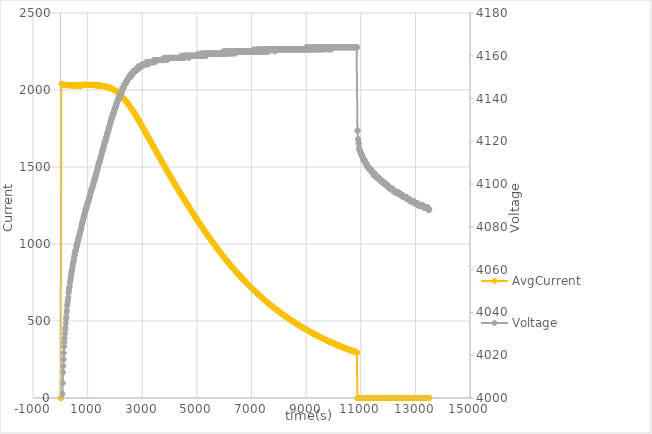
| Category | AvgCurrent |
|---|---|
| 10.006 | 0 |
| 20.006 | 0 |
| 30.019 | 0 |
| 40.023 | 2040 |
| 50.027 | 2039 |
| 60.031 | 2038 |
| 70.038 | 2037 |
| 80.047 | 2036 |
| 90.062 | 2036 |
| 100.077 | 2036 |
| 110.084 | 2035 |
| 120.089 | 2035 |
| 130.104 | 2035 |
| 140.104 | 2034 |
| 150.116 | 2034 |
| 160.123 | 2034 |
| 170.134 | 2033 |
| 180.145 | 2033 |
| 190.158 | 2033 |
| 200.158 | 2032 |
| 210.168 | 2033 |
| 220.179 | 2032 |
| 230.188 | 2032 |
| 240.195 | 2032 |
| 250.199 | 2032 |
| 260.206 | 2032 |
| 270.21 | 2031 |
| 280.215 | 2031 |
| 290.226 | 2031 |
| 300.24 | 2032 |
| 310.255 | 2031 |
| 320.259 | 2031 |
| 330.265 | 2031 |
| 340.281 | 2031 |
| 350.292 | 2031 |
| 360.301 | 2031 |
| 370.305 | 2031 |
| 380.309 | 2031 |
| 390.318 | 2031 |
| 400.33 | 2031 |
| 410.338 | 2031 |
| 420.349 | 2031 |
| 430.361 | 2031 |
| 440.387 | 2030 |
| 450.39 | 2030 |
| 460.401 | 2030 |
| 470.414 | 2030 |
| 480.427 | 2030 |
| 490.437 | 2030 |
| 500.45 | 2030 |
| 510.456 | 2030 |
| 520.49 | 2030 |
| 530.471 | 2030 |
| 540.505 | 2030 |
| 550.492 | 2030 |
| 560.556 | 2029 |
| 570.515 | 2029 |
| 580.604 | 2029 |
| 590.523 | 2030 |
| 600.673 | 2029 |
| 610.548 | 2029 |
| 620.68 | 2029 |
| 630.57 | 2029 |
| 640.741 | 2029 |
| 650.585 | 2029 |
| 660.775 | 2029 |
| 670.61 | 2029 |
| 680.835 | 2029 |
| 690.627 | 2029 |
| 700.866 | 2029 |
| 710.634 | 2029 |
| 720.899 | 2028 |
| 730.649 | 2029 |
| 740.929 | 2028 |
| 750.658 | 2028 |
| 760.978 | 2029 |
| 770.673 | 2028 |
| 781.023 | 2034 |
| 790.688 | 2034 |
| 801.056 | 2033 |
| 810.709 | 2034 |
| 821.145 | 2034 |
| 830.724 | 2033 |
| 841.147 | 2034 |
| 850.737 | 2033 |
| 861.178 | 2033 |
| 870.761 | 2033 |
| 881.212 | 2033 |
| 890.78 | 2033 |
| 901.255 | 2033 |
| 910.786 | 2033 |
| 921.317 | 2034 |
| 930.812 | 2034 |
| 941.32 | 2034 |
| 950.824 | 2034 |
| 961.398 | 2034 |
| 970.837 | 2034 |
| 981.415 | 2034 |
| 990.851 | 2034 |
| 1001.477 | 2033 |
| 1010.867 | 2034 |
| 1021.524 | 2033 |
| 1030.868 | 2033 |
| 1041.568 | 2033 |
| 1050.876 | 2033 |
| 1061.632 | 2033 |
| 1070.887 | 2033 |
| 1081.696 | 2033 |
| 1090.909 | 2033 |
| 1101.711 | 2032 |
| 1110.912 | 2033 |
| 1121.74 | 2033 |
| 1130.926 | 2033 |
| 1141.804 | 2033 |
| 1150.934 | 2032 |
| 1161.825 | 2032 |
| 1170.955 | 2032 |
| 1181.866 | 2032 |
| 1190.976 | 2032 |
| 1201.913 | 2032 |
| 1210.984 | 2032 |
| 1221.945 | 2032 |
| 1230.992 | 2032 |
| 1242.056 | 2032 |
| 1251.014 | 2031 |
| 1262.009 | 2031 |
| 1271.017 | 2031 |
| 1282.084 | 2031 |
| 1291.038 | 2031 |
| 1302.119 | 2031 |
| 1311.042 | 2031 |
| 1322.163 | 2031 |
| 1331.056 | 2031 |
| 1342.209 | 2030 |
| 1351.071 | 2030 |
| 1362.228 | 2030 |
| 1371.088 | 2029 |
| 1382.29 | 2030 |
| 1391.101 | 2030 |
| 1402.351 | 2030 |
| 1411.124 | 2030 |
| 1422.369 | 2030 |
| 1431.141 | 2030 |
| 1442.428 | 2029 |
| 1451.151 | 2028 |
| 1462.461 | 2028 |
| 1471.165 | 2028 |
| 1482.506 | 2027 |
| 1491.186 | 2027 |
| 1502.539 | 2027 |
| 1511.197 | 2027 |
| 1522.603 | 2026 |
| 1531.207 | 2026 |
| 1542.601 | 2026 |
| 1551.22 | 2026 |
| 1561.225 | 2026 |
| 1571.225 | 2025 |
| 1581.237 | 2024 |
| 1591.245 | 2024 |
| 1601.25 | 2024 |
| 1611.252 | 2024 |
| 1621.256 | 2023 |
| 1631.266 | 2023 |
| 1641.281 | 2023 |
| 1651.291 | 2022 |
| 1661.303 | 2022 |
| 1671.312 | 2022 |
| 1681.311 | 2021 |
| 1691.312 | 2020 |
| 1701.314 | 2020 |
| 1711.322 | 2020 |
| 1721.338 | 2019 |
| 1731.342 | 2018 |
| 1741.344 | 2018 |
| 1751.357 | 2017 |
| 1761.362 | 2017 |
| 1771.373 | 2016 |
| 1781.38 | 2016 |
| 1791.393 | 2015 |
| 1801.407 | 2014 |
| 1811.407 | 2014 |
| 1821.419 | 2013 |
| 1831.432 | 2012 |
| 1841.437 | 2012 |
| 1851.439 | 2011 |
| 1861.451 | 2010 |
| 1871.459 | 2010 |
| 1881.472 | 2008 |
| 1891.475 | 2008 |
| 1901.531 | 2007 |
| 1911.543 | 2006 |
| 1921.551 | 2005 |
| 1931.566 | 2004 |
| 1941.573 | 2003 |
| 1951.585 | 2002 |
| 1961.589 | 2001 |
| 1971.593 | 2000 |
| 1981.601 | 1999 |
| 1991.607 | 1997 |
| 2001.616 | 1996 |
| 2011.629 | 1996 |
| 2021.635 | 1994 |
| 2031.639 | 1993 |
| 2041.652 | 1992 |
| 2051.652 | 1991 |
| 2061.664 | 1989 |
| 2071.679 | 1988 |
| 2081.692 | 1986 |
| 2091.697 | 1985 |
| 2101.709 | 1984 |
| 2111.712 | 1983 |
| 2121.721 | 1981 |
| 2131.732 | 1979 |
| 2141.737 | 1978 |
| 2151.758 | 1976 |
| 2161.744 | 1975 |
| 2171.819 | 1961 |
| 2181.768 | 1969 |
| 2191.897 | 1968 |
| 2201.794 | 1960 |
| 2211.883 | 1961 |
| 2221.807 | 1960 |
| 2231.897 | 1959 |
| 2241.833 | 1957 |
| 2251.93 | 1956 |
| 2261.849 | 1954 |
| 2271.961 | 1954 |
| 2281.866 | 1952 |
| 2292.022 | 1950 |
| 2301.869 | 1948 |
| 2312.023 | 1947 |
| 2321.88 | 1946 |
| 2332.084 | 1943 |
| 2341.891 | 1941 |
| 2352.102 | 1939 |
| 2361.907 | 1937 |
| 2372.147 | 1935 |
| 2381.927 | 1932 |
| 2392.193 | 1931 |
| 2401.95 | 1928 |
| 2412.227 | 1926 |
| 2421.971 | 1924 |
| 2432.227 | 1922 |
| 2441.987 | 1919 |
| 2452.273 | 1917 |
| 2462.007 | 1915 |
| 2472.322 | 1912 |
| 2482.018 | 1910 |
| 2492.336 | 1907 |
| 2502.04 | 1905 |
| 2512.367 | 1902 |
| 2522.066 | 1900 |
| 2532.385 | 1898 |
| 2542.091 | 1895 |
| 2552.491 | 1892 |
| 2562.109 | 1890 |
| 2572.523 | 1887 |
| 2582.118 | 1884 |
| 2592.555 | 1882 |
| 2602.131 | 1880 |
| 2612.556 | 1877 |
| 2622.143 | 1874 |
| 2632.618 | 1872 |
| 2642.167 | 1869 |
| 2652.664 | 1866 |
| 2662.178 | 1863 |
| 2672.695 | 1861 |
| 2682.181 | 1858 |
| 2692.759 | 1855 |
| 2702.197 | 1853 |
| 2712.773 | 1849 |
| 2722.218 | 1847 |
| 2732.805 | 1844 |
| 2742.235 | 1841 |
| 2752.834 | 1837 |
| 2762.242 | 1836 |
| 2772.848 | 1832 |
| 2782.257 | 1830 |
| 2792.884 | 1826 |
| 2802.266 | 1823 |
| 2812.91 | 1820 |
| 2822.294 | 1818 |
| 2832.955 | 1814 |
| 2842.317 | 1812 |
| 2853.019 | 1808 |
| 2862.326 | 1806 |
| 2873.065 | 1803 |
| 2882.336 | 1799 |
| 2893.08 | 1797 |
| 2902.354 | 1793 |
| 2913.142 | 1791 |
| 2922.365 | 1788 |
| 2933.176 | 1784 |
| 2942.38 | 1782 |
| 2953.218 | 1776 |
| 2962.399 | 1774 |
| 2973.266 | 1770 |
| 2982.418 | 1768 |
| 2993.264 | 1765 |
| 3002.427 | 1761 |
| 3013.328 | 1758 |
| 3022.438 | 1755 |
| 3033.357 | 1752 |
| 3042.445 | 1749 |
| 3053.386 | 1746 |
| 3062.457 | 1743 |
| 3073.419 | 1740 |
| 3082.465 | 1737 |
| 3093.529 | 1734 |
| 3102.487 | 1731 |
| 3113.512 | 1727 |
| 3122.499 | 1725 |
| 3133.512 | 1721 |
| 3142.502 | 1719 |
| 3153.59 | 1714 |
| 3162.512 | 1712 |
| 3173.589 | 1708 |
| 3182.539 | 1705 |
| 3193.619 | 1702 |
| 3202.546 | 1699 |
| 3213.664 | 1695 |
| 3222.57 | 1693 |
| 3233.708 | 1689 |
| 3242.587 | 1687 |
| 3253.755 | 1683 |
| 3262.615 | 1680 |
| 3273.787 | 1676 |
| 3282.636 | 1674 |
| 3293.801 | 1670 |
| 3302.648 | 1667 |
| 3313.88 | 1664 |
| 3322.664 | 1660 |
| 3333.927 | 1657 |
| 3342.68 | 1654 |
| 3353.893 | 1651 |
| 3362.689 | 1648 |
| 3373.957 | 1644 |
| 3382.701 | 1641 |
| 3394.003 | 1638 |
| 3402.725 | 1635 |
| 3413.955 | 1631 |
| 3422.736 | 1629 |
| 3434.017 | 1625 |
| 3442.759 | 1623 |
| 3454.111 | 1619 |
| 3462.775 | 1616 |
| 3474.094 | 1613 |
| 3482.784 | 1610 |
| 3494.126 | 1606 |
| 3502.789 | 1603 |
| 3514.219 | 1599 |
| 3522.818 | 1597 |
| 3534.202 | 1593 |
| 3542.825 | 1590 |
| 3554.246 | 1587 |
| 3562.84 | 1583 |
| 3572.843 | 1581 |
| 3582.846 | 1578 |
| 3592.866 | 1575 |
| 3602.873 | 1572 |
| 3612.884 | 1568 |
| 3622.892 | 1566 |
| 3632.904 | 1562 |
| 3642.911 | 1559 |
| 3652.913 | 1556 |
| 3662.923 | 1553 |
| 3672.924 | 1550 |
| 3682.93 | 1546 |
| 3692.945 | 1543 |
| 3702.946 | 1540 |
| 3712.956 | 1537 |
| 3722.956 | 1534 |
| 3732.966 | 1530 |
| 3742.981 | 1527 |
| 3752.996 | 1524 |
| 3763.006 | 1521 |
| 3773.009 | 1518 |
| 3783.02 | 1515 |
| 3793.03 | 1512 |
| 3803.043 | 1509 |
| 3813.05 | 1506 |
| 3823.05 | 1503 |
| 3833.054 | 1499 |
| 3843.056 | 1496 |
| 3853.071 | 1493 |
| 3863.08 | 1490 |
| 3873.083 | 1487 |
| 3883.098 | 1484 |
| 3893.113 | 1481 |
| 3903.118 | 1477 |
| 3913.118 | 1474 |
| 3923.118 | 1471 |
| 3933.128 | 1468 |
| 3943.13 | 1465 |
| 3953.142 | 1462 |
| 3963.146 | 1459 |
| 3973.16 | 1457 |
| 3983.169 | 1453 |
| 3993.174 | 1450 |
| 4003.18 | 1447 |
| 4013.192 | 1444 |
| 4023.204 | 1441 |
| 4033.208 | 1437 |
| 4043.214 | 1435 |
| 4053.219 | 1432 |
| 4063.22 | 1429 |
| 4073.226 | 1425 |
| 4083.24 | 1422 |
| 4093.242 | 1419 |
| 4103.247 | 1417 |
| 4113.249 | 1413 |
| 4123.254 | 1410 |
| 4133.266 | 1407 |
| 4143.278 | 1404 |
| 4153.279 | 1402 |
| 4163.326 | 1398 |
| 4173.294 | 1395 |
| 4183.341 | 1393 |
| 4193.311 | 1389 |
| 4203.371 | 1386 |
| 4213.34 | 1384 |
| 4223.415 | 1380 |
| 4233.362 | 1377 |
| 4243.45 | 1374 |
| 4253.383 | 1371 |
| 4263.498 | 1368 |
| 4273.39 | 1365 |
| 4283.54 | 1363 |
| 4293.411 | 1360 |
| 4303.543 | 1357 |
| 4313.423 | 1354 |
| 4323.572 | 1351 |
| 4333.446 | 1348 |
| 4343.588 | 1345 |
| 4353.453 | 1341 |
| 4363.631 | 1339 |
| 4373.472 | 1336 |
| 4383.647 | 1333 |
| 4393.494 | 1330 |
| 4403.715 | 1327 |
| 4413.509 | 1325 |
| 4423.724 | 1321 |
| 4433.524 | 1318 |
| 4443.757 | 1315 |
| 4453.549 | 1313 |
| 4463.804 | 1310 |
| 4473.573 | 1307 |
| 4483.831 | 1304 |
| 4493.589 | 1301 |
| 4503.883 | 1298 |
| 4513.611 | 1295 |
| 4523.91 | 1293 |
| 4533.621 | 1290 |
| 4543.974 | 1287 |
| 4553.625 | 1284 |
| 4563.978 | 1281 |
| 4573.636 | 1279 |
| 4584.018 | 1275 |
| 4593.664 | 1273 |
| 4604.036 | 1270 |
| 4613.685 | 1267 |
| 4624.048 | 1264 |
| 4633.706 | 1262 |
| 4644.112 | 1259 |
| 4653.715 | 1256 |
| 4664.109 | 1253 |
| 4673.73 | 1250 |
| 4684.157 | 1247 |
| 4693.733 | 1245 |
| 4704.188 | 1242 |
| 4713.745 | 1239 |
| 4724.234 | 1236 |
| 4733.764 | 1233 |
| 4744.282 | 1230 |
| 4753.78 | 1228 |
| 4764.313 | 1225 |
| 4773.799 | 1222 |
| 4784.311 | 1219 |
| 4793.814 | 1217 |
| 4804.341 | 1213 |
| 4813.835 | 1211 |
| 4824.374 | 1208 |
| 4833.852 | 1206 |
| 4844.403 | 1202 |
| 4853.868 | 1200 |
| 4864.436 | 1197 |
| 4873.89 | 1194 |
| 4884.497 | 1191 |
| 4893.915 | 1189 |
| 4904.544 | 1186 |
| 4913.927 | 1183 |
| 4924.56 | 1180 |
| 4933.937 | 1178 |
| 4944.588 | 1175 |
| 4953.941 | 1172 |
| 4964.653 | 1170 |
| 4973.957 | 1167 |
| 4984.669 | 1164 |
| 4993.981 | 1162 |
| 5004.686 | 1159 |
| 5013.995 | 1156 |
| 5024.785 | 1153 |
| 5034.007 | 1151 |
| 5044.761 | 1148 |
| 5054.014 | 1146 |
| 5064.825 | 1143 |
| 5074.044 | 1140 |
| 5084.855 | 1138 |
| 5094.048 | 1135 |
| 5104.901 | 1132 |
| 5114.055 | 1129 |
| 5124.92 | 1127 |
| 5134.066 | 1124 |
| 5144.964 | 1121 |
| 5154.074 | 1119 |
| 5164.994 | 1116 |
| 5174.093 | 1114 |
| 5185.074 | 1110 |
| 5194.105 | 1109 |
| 5205.089 | 1106 |
| 5214.123 | 1103 |
| 5225.149 | 1101 |
| 5234.138 | 1099 |
| 5245.199 | 1095 |
| 5254.152 | 1093 |
| 5265.196 | 1090 |
| 5274.172 | 1088 |
| 5285.242 | 1085 |
| 5294.189 | 1083 |
| 5305.243 | 1079 |
| 5314.198 | 1077 |
| 5325.259 | 1075 |
| 5334.221 | 1072 |
| 5345.334 | 1070 |
| 5354.229 | 1067 |
| 5365.398 | 1064 |
| 5374.251 | 1062 |
| 5385.444 | 1059 |
| 5394.262 | 1057 |
| 5405.46 | 1054 |
| 5414.267 | 1052 |
| 5425.473 | 1049 |
| 5434.291 | 1047 |
| 5445.664 | 1044 |
| 5454.302 | 1042 |
| 5465.601 | 1039 |
| 5474.318 | 1037 |
| 5485.63 | 1034 |
| 5494.34 | 1032 |
| 5505.644 | 1029 |
| 5514.347 | 1027 |
| 5525.769 | 1024 |
| 5534.362 | 1022 |
| 5545.754 | 1019 |
| 5554.373 | 1017 |
| 5565.816 | 1015 |
| 5574.381 | 1012 |
| 5584.383 | 1010 |
| 5594.386 | 1008 |
| 5604.398 | 1005 |
| 5614.413 | 1003 |
| 5624.42 | 1000 |
| 5634.427 | 997 |
| 5644.429 | 995 |
| 5654.438 | 993 |
| 5664.443 | 991 |
| 5674.455 | 989 |
| 5684.467 | 986 |
| 5694.474 | 984 |
| 5704.479 | 981 |
| 5714.48 | 978 |
| 5724.492 | 977 |
| 5734.503 | 974 |
| 5744.512 | 972 |
| 5754.514 | 969 |
| 5764.522 | 967 |
| 5774.528 | 964 |
| 5784.535 | 962 |
| 5794.536 | 960 |
| 5804.549 | 957 |
| 5814.551 | 955 |
| 5824.56 | 953 |
| 5834.573 | 951 |
| 5844.575 | 948 |
| 5854.59 | 946 |
| 5864.59 | 944 |
| 5874.593 | 941 |
| 5884.604 | 939 |
| 5894.61 | 937 |
| 5904.613 | 934 |
| 5914.625 | 932 |
| 5924.629 | 930 |
| 5934.63 | 928 |
| 5944.636 | 925 |
| 5954.637 | 923 |
| 5964.639 | 921 |
| 5974.672 | 919 |
| 5984.655 | 916 |
| 5994.706 | 915 |
| 6004.684 | 912 |
| 6014.809 | 909 |
| 6024.695 | 907 |
| 6034.823 | 906 |
| 6044.717 | 903 |
| 6054.808 | 900 |
| 6064.731 | 899 |
| 6074.903 | 896 |
| 6084.755 | 894 |
| 6094.976 | 892 |
| 6104.761 | 890 |
| 6114.936 | 887 |
| 6124.779 | 885 |
| 6135.011 | 883 |
| 6144.793 | 881 |
| 6155.039 | 878 |
| 6164.807 | 876 |
| 6175.056 | 875 |
| 6184.821 | 873 |
| 6195.171 | 870 |
| 6204.826 | 868 |
| 6215.231 | 866 |
| 6224.844 | 864 |
| 6235.208 | 861 |
| 6244.862 | 860 |
| 6255.353 | 857 |
| 6264.876 | 856 |
| 6275.382 | 853 |
| 6284.891 | 851 |
| 6295.383 | 849 |
| 6304.908 | 847 |
| 6315.463 | 845 |
| 6324.914 | 843 |
| 6335.524 | 840 |
| 6344.922 | 838 |
| 6355.538 | 837 |
| 6364.938 | 834 |
| 6375.554 | 832 |
| 6384.951 | 830 |
| 6395.6 | 829 |
| 6404.973 | 826 |
| 6415.616 | 824 |
| 6424.989 | 822 |
| 6435.675 | 821 |
| 6444.992 | 818 |
| 6455.754 | 816 |
| 6465.01 | 815 |
| 6475.783 | 812 |
| 6485.024 | 810 |
| 6495.877 | 808 |
| 6505.041 | 806 |
| 6515.883 | 804 |
| 6525.051 | 803 |
| 6535.894 | 800 |
| 6545.058 | 799 |
| 6555.924 | 797 |
| 6565.074 | 795 |
| 6576.035 | 792 |
| 6585.1 | 791 |
| 6596.035 | 789 |
| 6605.121 | 787 |
| 6616.096 | 785 |
| 6625.133 | 783 |
| 6636.129 | 781 |
| 6645.137 | 779 |
| 6656.124 | 777 |
| 6665.151 | 775 |
| 6676.22 | 773 |
| 6685.161 | 772 |
| 6696.253 | 770 |
| 6705.184 | 768 |
| 6716.28 | 766 |
| 6725.203 | 764 |
| 6736.361 | 762 |
| 6745.207 | 761 |
| 6756.392 | 759 |
| 6765.219 | 757 |
| 6776.372 | 755 |
| 6785.24 | 753 |
| 6796.456 | 751 |
| 6805.258 | 750 |
| 6816.486 | 747 |
| 6825.278 | 746 |
| 6836.561 | 744 |
| 6845.284 | 742 |
| 6856.543 | 740 |
| 6865.299 | 738 |
| 6876.592 | 737 |
| 6885.32 | 735 |
| 6896.606 | 733 |
| 6905.322 | 731 |
| 6916.668 | 729 |
| 6925.334 | 728 |
| 6936.7 | 726 |
| 6945.343 | 724 |
| 6956.796 | 722 |
| 6965.364 | 721 |
| 6976.843 | 719 |
| 6985.381 | 718 |
| 6995.39 | 716 |
| 7005.393 | 713 |
| 7015.406 | 712 |
| 7025.415 | 710 |
| 7035.422 | 709 |
| 7045.431 | 707 |
| 7055.444 | 705 |
| 7065.452 | 704 |
| 7075.454 | 701 |
| 7085.463 | 700 |
| 7095.475 | 698 |
| 7105.487 | 697 |
| 7115.5 | 695 |
| 7125.515 | 693 |
| 7135.528 | 691 |
| 7145.535 | 690 |
| 7155.551 | 688 |
| 7165.553 | 686 |
| 7175.567 | 685 |
| 7185.571 | 683 |
| 7195.58 | 682 |
| 7205.59 | 679 |
| 7215.605 | 678 |
| 7225.615 | 676 |
| 7235.618 | 675 |
| 7245.624 | 673 |
| 7255.634 | 672 |
| 7265.636 | 670 |
| 7275.643 | 668 |
| 7285.643 | 667 |
| 7295.656 | 665 |
| 7305.656 | 664 |
| 7315.669 | 662 |
| 7325.679 | 660 |
| 7335.687 | 659 |
| 7345.69 | 657 |
| 7355.703 | 655 |
| 7365.711 | 654 |
| 7375.723 | 652 |
| 7385.728 | 651 |
| 7395.728 | 649 |
| 7405.811 | 647 |
| 7415.751 | 646 |
| 7425.793 | 644 |
| 7435.758 | 643 |
| 7445.855 | 641 |
| 7455.778 | 640 |
| 7465.916 | 638 |
| 7475.806 | 637 |
| 7485.915 | 635 |
| 7495.813 | 634 |
| 7505.977 | 632 |
| 7515.827 | 631 |
| 7525.993 | 629 |
| 7535.835 | 628 |
| 7546.023 | 626 |
| 7555.845 | 625 |
| 7566.12 | 623 |
| 7575.849 | 622 |
| 7586.116 | 620 |
| 7595.866 | 619 |
| 7606.165 | 617 |
| 7615.885 | 616 |
| 7626.2 | 614 |
| 7635.909 | 613 |
| 7646.258 | 611 |
| 7655.917 | 610 |
| 7666.336 | 608 |
| 7675.923 | 606 |
| 7686.386 | 605 |
| 7695.939 | 604 |
| 7706.367 | 603 |
| 7715.947 | 601 |
| 7726.484 | 600 |
| 7735.969 | 598 |
| 7746.46 | 597 |
| 7755.984 | 596 |
| 7766.54 | 594 |
| 7776.002 | 593 |
| 7786.572 | 591 |
| 7796.029 | 589 |
| 7806.589 | 588 |
| 7816.048 | 587 |
| 7826.619 | 586 |
| 7836.068 | 584 |
| 7846.695 | 583 |
| 7856.082 | 581 |
| 7866.729 | 580 |
| 7876.097 | 579 |
| 7886.803 | 577 |
| 7896.112 | 576 |
| 7906.867 | 574 |
| 7916.121 | 573 |
| 7926.916 | 572 |
| 7936.132 | 570 |
| 7946.913 | 569 |
| 7956.157 | 568 |
| 7967.008 | 566 |
| 7976.161 | 565 |
| 7987.022 | 564 |
| 7996.169 | 562 |
| 8007.023 | 561 |
| 8016.177 | 559 |
| 8027.083 | 558 |
| 8036.204 | 557 |
| 8047.149 | 555 |
| 8056.225 | 554 |
| 8067.148 | 552 |
| 8076.234 | 551 |
| 8087.222 | 550 |
| 8096.257 | 549 |
| 8107.285 | 547 |
| 8116.276 | 547 |
| 8127.333 | 545 |
| 8136.3 | 544 |
| 8147.399 | 543 |
| 8156.315 | 541 |
| 8167.46 | 540 |
| 8176.34 | 539 |
| 8187.44 | 537 |
| 8196.358 | 536 |
| 8207.521 | 535 |
| 8216.381 | 534 |
| 8227.523 | 532 |
| 8236.393 | 531 |
| 8247.617 | 530 |
| 8256.419 | 529 |
| 8267.615 | 527 |
| 8276.429 | 527 |
| 8287.646 | 525 |
| 8296.452 | 524 |
| 8307.692 | 522 |
| 8316.462 | 521 |
| 8327.674 | 520 |
| 8336.474 | 519 |
| 8347.738 | 518 |
| 8356.497 | 516 |
| 8367.792 | 515 |
| 8376.513 | 514 |
| 8387.849 | 512 |
| 8396.525 | 512 |
| 8407.878 | 511 |
| 8416.542 | 509 |
| 8427.912 | 508 |
| 8436.555 | 507 |
| 8447.965 | 505 |
| 8456.573 | 504 |
| 8468.055 | 503 |
| 8476.591 | 502 |
| 8488.036 | 501 |
| 8496.604 | 499 |
| 8506.606 | 498 |
| 8516.61 | 497 |
| 8526.619 | 496 |
| 8536.63 | 495 |
| 8546.632 | 494 |
| 8556.643 | 492 |
| 8566.646 | 492 |
| 8576.66 | 491 |
| 8586.671 | 489 |
| 8596.682 | 488 |
| 8606.684 | 487 |
| 8616.696 | 486 |
| 8626.707 | 485 |
| 8636.718 | 484 |
| 8646.725 | 482 |
| 8656.728 | 481 |
| 8666.74 | 481 |
| 8676.744 | 479 |
| 8686.757 | 478 |
| 8696.764 | 477 |
| 8706.772 | 476 |
| 8716.776 | 475 |
| 8726.781 | 473 |
| 8736.791 | 472 |
| 8746.805 | 471 |
| 8756.807 | 471 |
| 8766.82 | 469 |
| 8776.826 | 468 |
| 8786.835 | 467 |
| 8796.844 | 466 |
| 8806.851 | 465 |
| 8816.859 | 464 |
| 8826.87 | 463 |
| 8836.882 | 462 |
| 8846.897 | 461 |
| 8856.908 | 459 |
| 8866.921 | 458 |
| 8876.929 | 457 |
| 8886.942 | 456 |
| 8896.948 | 456 |
| 8906.955 | 454 |
| 8916.965 | 453 |
| 8926.98 | 452 |
| 8936.988 | 451 |
| 8946.996 | 450 |
| 8957.072 | 449 |
| 8967.004 | 449 |
| 8977.046 | 447 |
| 8987.024 | 446 |
| 8997.117 | 445 |
| 9007.031 | 444 |
| 9017.173 | 442 |
| 9027.058 | 442 |
| 9037.206 | 441 |
| 9047.065 | 440 |
| 9057.221 | 439 |
| 9067.082 | 438 |
| 9077.251 | 437 |
| 9087.103 | 436 |
| 9097.331 | 435 |
| 9107.119 | 434 |
| 9117.377 | 433 |
| 9127.144 | 432 |
| 9137.438 | 431 |
| 9147.162 | 430 |
| 9157.479 | 429 |
| 9167.183 | 428 |
| 9177.508 | 427 |
| 9187.198 | 426 |
| 9197.519 | 425 |
| 9207.203 | 424 |
| 9217.609 | 423 |
| 9227.23 | 422 |
| 9237.684 | 421 |
| 9247.25 | 420 |
| 9257.692 | 419 |
| 9267.263 | 418 |
| 9277.796 | 417 |
| 9287.273 | 416 |
| 9297.749 | 415 |
| 9307.298 | 414 |
| 9317.799 | 413 |
| 9327.318 | 412 |
| 9337.833 | 411 |
| 9347.339 | 410 |
| 9357.908 | 410 |
| 9367.345 | 408 |
| 9377.946 | 408 |
| 9387.363 | 406 |
| 9398.014 | 406 |
| 9407.379 | 404 |
| 9418.03 | 404 |
| 9427.381 | 403 |
| 9438.097 | 402 |
| 9447.393 | 401 |
| 9458.06 | 400 |
| 9467.409 | 400 |
| 9478.141 | 398 |
| 9487.424 | 398 |
| 9498.225 | 396 |
| 9507.435 | 396 |
| 9518.237 | 395 |
| 9527.455 | 394 |
| 9538.341 | 393 |
| 9547.471 | 393 |
| 9558.309 | 391 |
| 9567.487 | 390 |
| 9578.398 | 389 |
| 9587.501 | 389 |
| 9598.414 | 388 |
| 9607.521 | 388 |
| 9618.419 | 387 |
| 9627.542 | 386 |
| 9638.497 | 384 |
| 9647.571 | 384 |
| 9658.516 | 382 |
| 9667.588 | 382 |
| 9678.602 | 381 |
| 9687.593 | 380 |
| 9698.664 | 379 |
| 9707.618 | 379 |
| 9718.649 | 378 |
| 9727.628 | 377 |
| 9738.67 | 376 |
| 9747.641 | 375 |
| 9758.761 | 374 |
| 9767.649 | 373 |
| 9778.797 | 372 |
| 9787.673 | 372 |
| 9798.827 | 371 |
| 9807.687 | 370 |
| 9818.918 | 369 |
| 9827.712 | 368 |
| 9838.983 | 367 |
| 9847.732 | 366 |
| 9858.993 | 366 |
| 9867.753 | 365 |
| 9879.005 | 364 |
| 9887.761 | 364 |
| 9899.061 | 363 |
| 9907.779 | 362 |
| 9919.121 | 361 |
| 9927.794 | 360 |
| 9939.178 | 359 |
| 9947.811 | 359 |
| 9959.25 | 358 |
| 9967.832 | 357 |
| 9979.185 | 356 |
| 9987.846 | 356 |
| 9999.318 | 355 |
| 10007.852 | 354 |
| 10019.303 | 353 |
| 10027.875 | 352 |
| 10037.886 | 352 |
| 10047.89 | 351 |
| 10057.904 | 350 |
| 10067.907 | 350 |
| 10077.913 | 349 |
| 10087.926 | 348 |
| 10097.94 | 347 |
| 10107.947 | 347 |
| 10117.96 | 346 |
| 10127.966 | 345 |
| 10137.974 | 344 |
| 10147.988 | 343 |
| 10158.002 | 343 |
| 10168.009 | 342 |
| 10178.019 | 341 |
| 10188.025 | 341 |
| 10198.035 | 340 |
| 10208.039 | 339 |
| 10218.047 | 338 |
| 10228.06 | 337 |
| 10238.063 | 337 |
| 10248.072 | 336 |
| 10258.079 | 335 |
| 10268.084 | 334 |
| 10278.095 | 334 |
| 10288.102 | 333 |
| 10298.117 | 332 |
| 10308.129 | 332 |
| 10318.143 | 331 |
| 10328.152 | 330 |
| 10338.157 | 329 |
| 10348.166 | 329 |
| 10358.176 | 328 |
| 10368.177 | 327 |
| 10378.188 | 327 |
| 10388.197 | 326 |
| 10398.207 | 325 |
| 10408.247 | 325 |
| 10418.223 | 324 |
| 10428.275 | 323 |
| 10438.245 | 323 |
| 10448.299 | 322 |
| 10458.267 | 321 |
| 10468.395 | 321 |
| 10478.279 | 320 |
| 10488.335 | 319 |
| 10498.305 | 318 |
| 10508.417 | 318 |
| 10518.325 | 317 |
| 10528.451 | 317 |
| 10538.339 | 316 |
| 10548.481 | 315 |
| 10558.357 | 315 |
| 10568.552 | 314 |
| 10578.375 | 313 |
| 10588.555 | 312 |
| 10598.391 | 312 |
| 10608.558 | 311 |
| 10618.406 | 310 |
| 10628.588 | 310 |
| 10638.426 | 310 |
| 10648.701 | 309 |
| 10658.442 | 308 |
| 10668.744 | 307 |
| 10678.463 | 307 |
| 10688.808 | 306 |
| 10698.479 | 306 |
| 10708.822 | 305 |
| 10718.499 | 304 |
| 10728.873 | 303 |
| 10738.503 | 303 |
| 10748.899 | 302 |
| 10758.511 | 302 |
| 10768.9 | 302 |
| 10778.522 | 301 |
| 10788.966 | 300 |
| 10798.545 | 300 |
| 10809.009 | 298 |
| 10818.562 | 298 |
| 10829.065 | 297 |
| 10838.576 | 297 |
| 10849.086 | 296 |
| 10858.597 | 295 |
| 10869.118 | 295 |
| 10878.609 | 0 |
| 10889.219 | 0 |
| 10898.62 | 0 |
| 10909.183 | 0 |
| 10918.636 | 0 |
| 10929.28 | 0 |
| 10938.657 | 0 |
| 10949.307 | 0 |
| 10958.667 | 0 |
| 10969.325 | 0 |
| 10978.687 | 0 |
| 10989.369 | 0 |
| 10998.705 | 0 |
| 11009.437 | 0 |
| 11018.719 | 0 |
| 11029.445 | 0 |
| 11038.735 | 0 |
| 11049.542 | 0 |
| 11058.744 | 0 |
| 11069.592 | 0 |
| 11078.773 | 0 |
| 11089.59 | 0 |
| 11098.786 | 0 |
| 11109.748 | 0 |
| 11118.808 | 0 |
| 11129.708 | 0 |
| 11138.833 | 0 |
| 11149.728 | 0 |
| 11158.857 | 0 |
| 11169.775 | 0 |
| 11178.879 | 0 |
| 11189.79 | 0 |
| 11198.893 | 0 |
| 11209.858 | 0 |
| 11218.901 | 0 |
| 11229.878 | 0 |
| 11238.919 | 0 |
| 11249.996 | 0 |
| 11258.93 | 0 |
| 11269.995 | 0 |
| 11278.945 | 0 |
| 11290.024 | 0 |
| 11298.964 | 0 |
| 11310.1 | 0 |
| 11318.981 | 0 |
| 11330.118 | 0 |
| 11339.007 | 0 |
| 11350.202 | 0 |
| 11359.029 | 0 |
| 11370.229 | 0 |
| 11379.049 | 0 |
| 11390.243 | 0 |
| 11399.062 | 0 |
| 11410.271 | 0 |
| 11419.074 | 0 |
| 11430.353 | 0 |
| 11439.08 | 0 |
| 11450.384 | 0 |
| 11459.093 | 0 |
| 11470.447 | 0 |
| 11479.117 | 0 |
| 11490.511 | 0 |
| 11499.126 | 0 |
| 11510.524 | 0 |
| 11519.135 | 0 |
| 11530.569 | 0 |
| 11539.15 | 0 |
| 11549.161 | 0 |
| 11559.169 | 0 |
| 11569.176 | 0 |
| 11579.19 | 0 |
| 11589.199 | 0 |
| 11599.205 | 0 |
| 11609.209 | 0 |
| 11619.209 | 0 |
| 11629.224 | 0 |
| 11639.228 | 0 |
| 11649.232 | 0 |
| 11659.237 | 0 |
| 11669.238 | 0 |
| 11679.245 | 0 |
| 11689.25 | 0 |
| 11699.26 | 0 |
| 11709.271 | 0 |
| 11719.276 | 0 |
| 11729.287 | 0 |
| 11739.296 | 0 |
| 11749.304 | 0 |
| 11759.315 | 0 |
| 11769.325 | 0 |
| 11779.33 | 0 |
| 11789.338 | 0 |
| 11799.342 | 0 |
| 11809.353 | 0 |
| 11819.363 | 0 |
| 11829.375 | 0 |
| 11839.378 | 0 |
| 11849.387 | 0 |
| 11859.402 | 0 |
| 11869.417 | 0 |
| 11879.418 | 0 |
| 11889.419 | 0 |
| 11899.43 | 0 |
| 11909.436 | 0 |
| 11919.452 | 0 |
| 11929.445 | 0 |
| 11939.483 | 0 |
| 11949.472 | 0 |
| 11959.489 | 0 |
| 11969.478 | 0 |
| 11979.586 | 0 |
| 11989.489 | 0 |
| 11999.559 | 0 |
| 12009.508 | 0 |
| 12019.658 | 0 |
| 12029.531 | 0 |
| 12039.664 | 0 |
| 12049.545 | 0 |
| 12059.729 | 0 |
| 12069.557 | 0 |
| 12079.775 | 0 |
| 12089.571 | 0 |
| 12099.823 | 0 |
| 12109.593 | 0 |
| 12119.843 | 0 |
| 12129.611 | 0 |
| 12139.894 | 0 |
| 12149.627 | 0 |
| 12159.917 | 0 |
| 12169.641 | 0 |
| 12179.929 | 0 |
| 12189.658 | 0 |
| 12199.994 | 0 |
| 12209.674 | 0 |
| 12220.041 | 0 |
| 12229.69 | 0 |
| 12240.055 | 0 |
| 12249.704 | 0 |
| 12260.085 | 0 |
| 12269.723 | 0 |
| 12280.179 | 0 |
| 12289.745 | 0 |
| 12300.21 | 0 |
| 12309.764 | 0 |
| 12320.256 | 0 |
| 12329.784 | 0 |
| 12340.371 | 0 |
| 12349.8 | 0 |
| 12360.369 | 0 |
| 12369.812 | 0 |
| 12380.405 | 0 |
| 12389.826 | 0 |
| 12400.533 | 0 |
| 12409.846 | 0 |
| 12420.508 | 0 |
| 12429.86 | 0 |
| 12440.572 | 0 |
| 12449.876 | 0 |
| 12460.582 | 0 |
| 12469.891 | 0 |
| 12480.662 | 0 |
| 12489.909 | 0 |
| 12500.731 | 0 |
| 12509.93 | 0 |
| 12520.742 | 0 |
| 12529.943 | 0 |
| 12540.807 | 0 |
| 12549.949 | 0 |
| 12560.916 | 0 |
| 12569.973 | 0 |
| 12580.887 | 0 |
| 12589.994 | 0 |
| 12600.912 | 0 |
| 12609.997 | 0 |
| 12620.943 | 0 |
| 12630.013 | 0 |
| 12641.009 | 0 |
| 12650.019 | 0 |
| 12661.053 | 0 |
| 12670.035 | 0 |
| 12681.09 | 0 |
| 12690.056 | 0 |
| 12701.136 | 0 |
| 12710.065 | 0 |
| 12721.184 | 0 |
| 12730.085 | 0 |
| 12741.235 | 0 |
| 12750.096 | 0 |
| 12761.227 | 0 |
| 12770.108 | 0 |
| 12781.334 | 0 |
| 12790.129 | 0 |
| 12801.336 | 0 |
| 12810.153 | 0 |
| 12821.334 | 0 |
| 12830.158 | 0 |
| 12841.493 | 0 |
| 12850.171 | 0 |
| 12861.404 | 0 |
| 12870.184 | 0 |
| 12881.487 | 0 |
| 12890.192 | 0 |
| 12901.559 | 0 |
| 12910.213 | 0 |
| 12921.604 | 0 |
| 12930.22 | 0 |
| 12941.61 | 0 |
| 12950.243 | 0 |
| 12961.623 | 0 |
| 12970.26 | 0 |
| 12981.666 | 0 |
| 12990.275 | 0 |
| 13001.735 | 0 |
| 13010.29 | 0 |
| 13021.772 | 0 |
| 13030.32 | 0 |
| 13040.335 | 0 |
| 13050.343 | 0 |
| 13060.345 | 0 |
| 13070.35 | 0 |
| 13080.361 | 0 |
| 13090.373 | 0 |
| 13100.38 | 0 |
| 13110.384 | 0 |
| 13120.396 | 0 |
| 13130.404 | 0 |
| 13140.407 | 0 |
| 13150.419 | 0 |
| 13160.428 | 0 |
| 13170.441 | 0 |
| 13180.449 | 0 |
| 13190.453 | 0 |
| 13200.46 | 0 |
| 13210.466 | 0 |
| 13220.471 | 0 |
| 13230.473 | 0 |
| 13240.482 | 0 |
| 13250.492 | 0 |
| 13260.501 | 0 |
| 13270.502 | 0 |
| 13280.508 | 0 |
| 13290.523 | 0 |
| 13300.537 | 0 |
| 13310.549 | 0 |
| 13320.554 | 0 |
| 13330.565 | 0 |
| 13340.569 | 0 |
| 13350.582 | 0 |
| 13360.584 | 0 |
| 13370.584 | 0 |
| 13380.59 | 0 |
| 13390.593 | 0 |
| 13400.598 | 0 |
| 13410.607 | 0 |
| 13420.617 | 0 |
| 13430.632 | 0 |
| 13440.645 | 0 |
| 13450.72 | 0 |
| 13460.665 | 0 |
| 13470.722 | 0 |
| 13480.688 | 0 |
| 13490.733 | 0 |
| 13500.692 | 0 |
| 13510.789 | 0 |